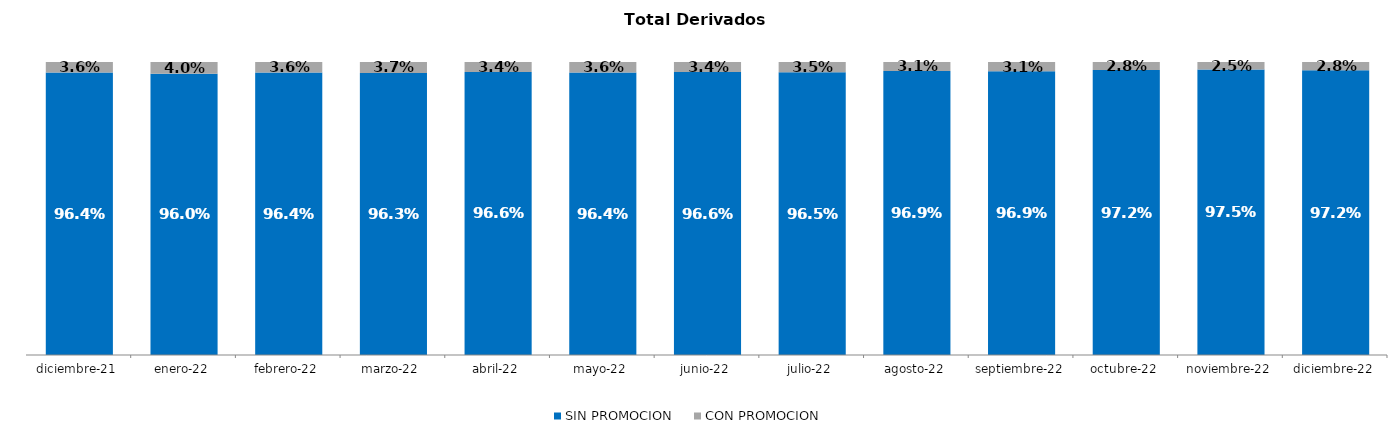
| Category | SIN PROMOCION   | CON PROMOCION   |
|---|---|---|
| 2021-12-01 | 0.964 | 0.036 |
| 2022-01-01 | 0.96 | 0.04 |
| 2022-02-01 | 0.964 | 0.036 |
| 2022-03-01 | 0.963 | 0.037 |
| 2022-04-01 | 0.966 | 0.034 |
| 2022-05-01 | 0.964 | 0.036 |
| 2022-06-01 | 0.966 | 0.034 |
| 2022-07-01 | 0.965 | 0.035 |
| 2022-08-01 | 0.969 | 0.031 |
| 2022-09-01 | 0.969 | 0.031 |
| 2022-10-01 | 0.972 | 0.028 |
| 2022-11-01 | 0.975 | 0.025 |
| 2022-12-01 | 0.972 | 0.028 |